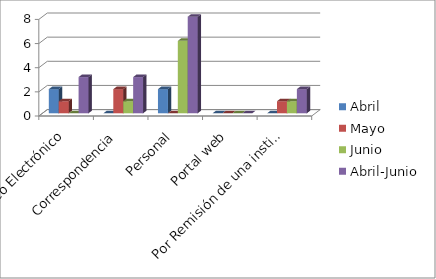
| Category | Abril | Mayo | Junio | Abril-Junio |
|---|---|---|---|---|
| Correo Electrónico | 2 | 1 | 0 | 3 |
| Correspondencia | 0 | 2 | 1 | 3 |
| Personal | 2 | 0 | 6 | 8 |
| Portal web | 0 | 0 | 0 | 0 |
| Por Remisión de una institución | 0 | 1 | 1 | 2 |